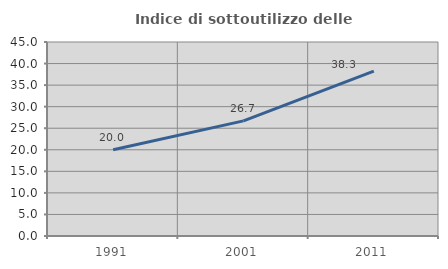
| Category | Indice di sottoutilizzo delle abitazioni  |
|---|---|
| 1991.0 | 20 |
| 2001.0 | 26.711 |
| 2011.0 | 38.252 |